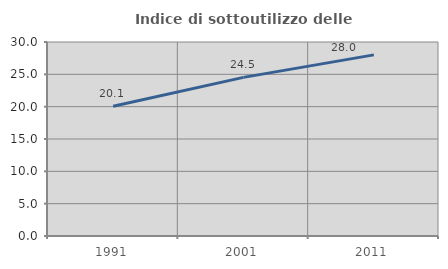
| Category | Indice di sottoutilizzo delle abitazioni  |
|---|---|
| 1991.0 | 20.064 |
| 2001.0 | 24.53 |
| 2011.0 | 28.006 |